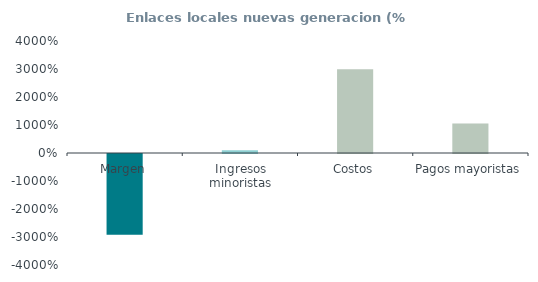
| Category | Enlaces locales nuevas generacion (% ingresos) |
|---|---|
| Margen | -28.879 |
| Ingresos minoristas | 1 |
| Costos | 29.879 |
| Pagos mayoristas | 10.505 |